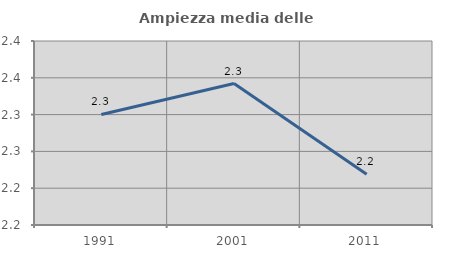
| Category | Ampiezza media delle famiglie |
|---|---|
| 1991.0 | 2.3 |
| 2001.0 | 2.342 |
| 2011.0 | 2.219 |